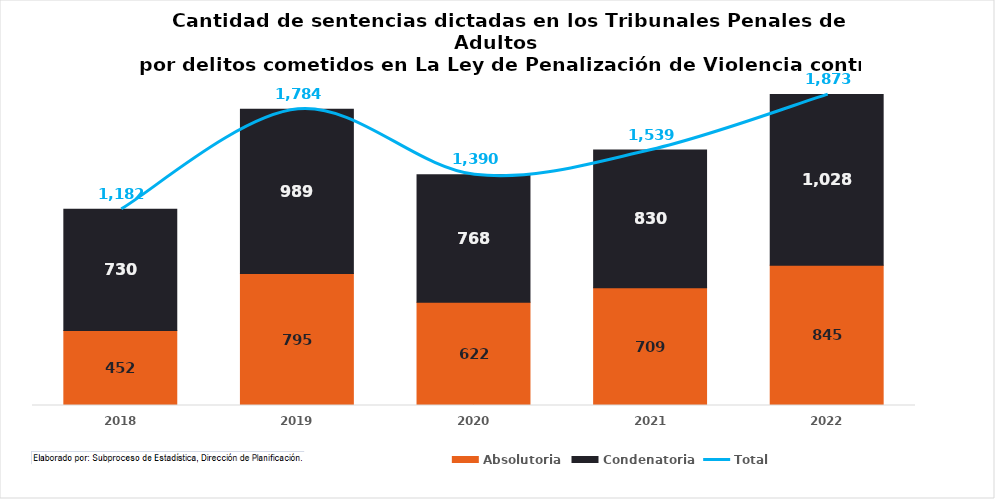
| Category | Absolutoria | Condenatoria |
|---|---|---|
| 2018.0 | 452 | 730 |
| 2019.0 | 795 | 989 |
| 2020.0 | 622 | 768 |
| 2021.0 | 709 | 830 |
| 2022.0 | 845 | 1028 |